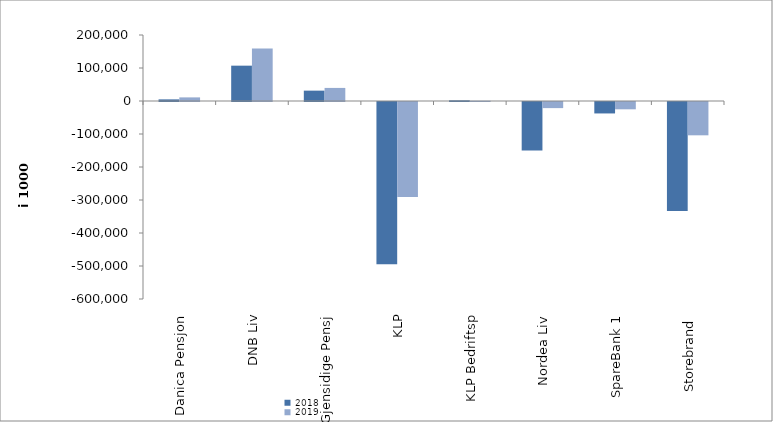
| Category | 2018 | 2019 |
|---|---|---|
| Danica Pensjon | 4929.812 | 10954.466 |
| DNB Liv | 107071 | 159065.881 |
| Gjensidige Pensj | 31387 | 39643 |
| KLP | -491426.718 | -287976.445 |
| KLP Bedriftsp | 2189 | 771 |
| Nordea Liv | -146808.559 | -18522.302 |
| SpareBank 1 | -34677.967 | -22140.237 |
| Storebrand  | -330309.93 | -100940.097 |